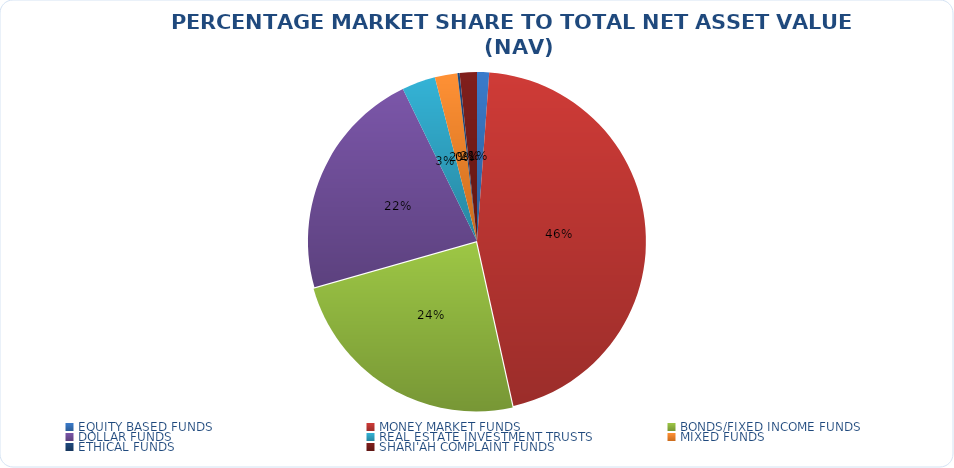
| Category | NET ASSET VALUE |
|---|---|
| EQUITY BASED FUNDS | 16656064177.77 |
| MONEY MARKET FUNDS | 652456174435.479 |
| BONDS/FIXED INCOME FUNDS | 345947135557.623 |
| DOLLAR FUNDS | 318934755543.127 |
| REAL ESTATE INVESTMENT TRUSTS | 46216946191.18 |
| MIXED FUNDS | 31041156130.042 |
| ETHICAL FUNDS | 3032033408.75 |
| SHARI'AH COMPLAINT FUNDS | 23622969337.44 |